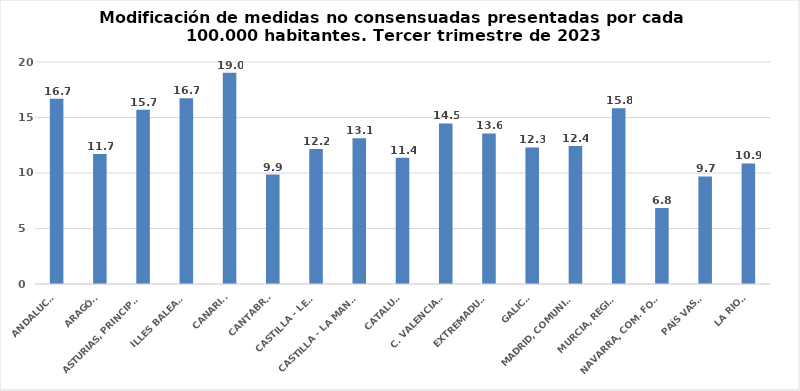
| Category | Series 0 |
|---|---|
| ANDALUCÍA | 16.684 |
| ARAGÓN | 11.71 |
| ASTURIAS, PRINCIPADO | 15.696 |
| ILLES BALEARS | 16.74 |
| CANARIAS | 19.025 |
| CANTABRIA | 9.855 |
| CASTILLA - LEÓN | 12.172 |
| CASTILLA - LA MANCHA | 13.121 |
| CATALUÑA | 11.381 |
| C. VALENCIANA | 14.468 |
| EXTREMADURA | 13.563 |
| GALICIA | 12.298 |
| MADRID, COMUNIDAD | 12.44 |
| MURCIA, REGIÓN | 15.844 |
| NAVARRA, COM. FORAL | 6.843 |
| PAÍS VASCO | 9.685 |
| LA RIOJA | 10.861 |